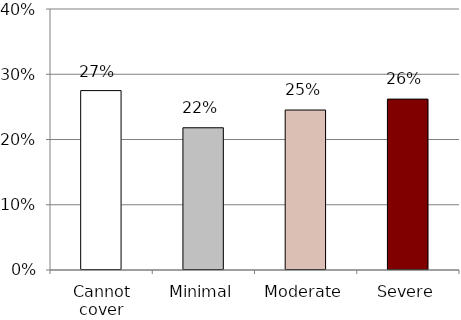
| Category | Percent covering LTSS w/ buffer |
|---|---|
| Cannot cover | 0.275 |
| Minimal | 0.218 |
| Moderate | 0.245 |
| Severe | 0.262 |